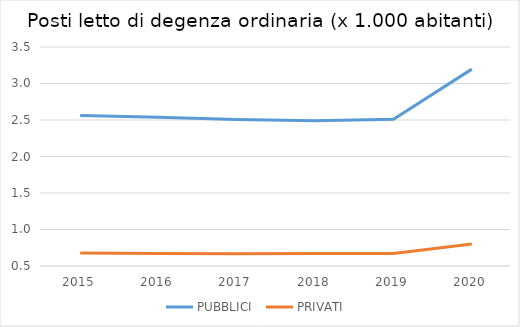
| Category | PUBBLICI | PRIVATI |
|---|---|---|
| 2015.0 | 2.562 | 0.676 |
| 2016.0 | 2.538 | 0.672 |
| 2017.0 | 2.507 | 0.669 |
| 2018.0 | 2.491 | 0.67 |
| 2019.0 | 2.511 | 0.671 |
| 2020.0 | 3.197 | 0.8 |